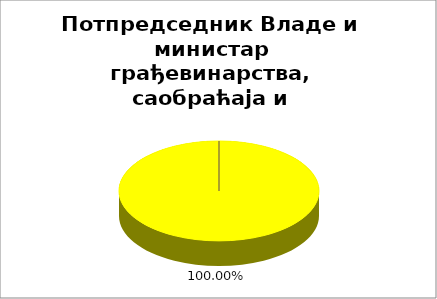
| Category | Потпредседник Владе и министар грађевинарства, саобраћаја и инфраструктуре |
|---|---|
| 0 | 0 |
| 1 | 0 |
| 2 | 1 |
| 3 | 0 |
| 4 | 0 |